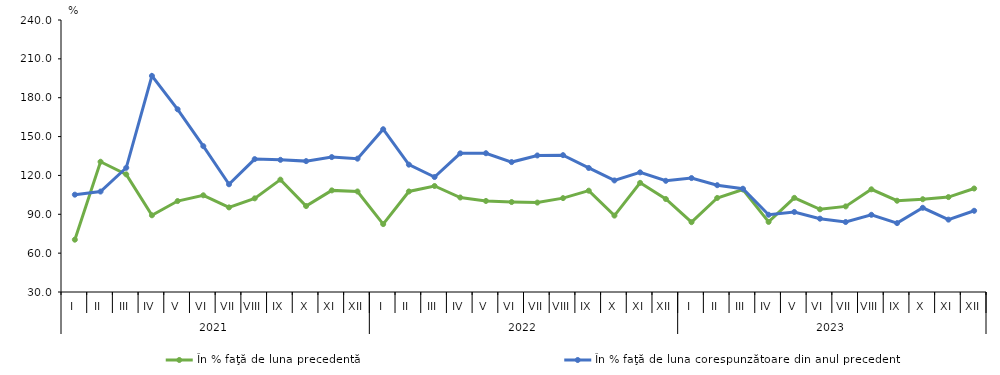
| Category | În % faţă de luna precedentă | În % faţă de luna corespunzătoare din anul precedent |
|---|---|---|
| 0 | 70.398 | 105.144 |
| 1 | 130.566 | 107.561 |
| 2 | 120.83 | 125.886 |
| 3 | 89.231 | 196.848 |
| 4 | 100.211 | 171.057 |
| 5 | 104.661 | 142.587 |
| 6 | 95.309 | 113.159 |
| 7 | 102.303 | 132.588 |
| 8 | 116.743 | 132.038 |
| 9 | 96.368 | 131.048 |
| 10 | 108.452 | 134.158 |
| 11 | 107.608 | 132.944 |
| 12 | 82.428 | 155.663 |
| 13 | 107.628 | 128.317 |
| 14 | 111.836 | 118.766 |
| 15 | 102.959 | 137.038 |
| 16 | 100.29 | 137.145 |
| 17 | 99.449 | 130.317 |
| 18 | 99.043 | 135.422 |
| 19 | 102.484 | 135.661 |
| 20 | 108.228 | 125.766 |
| 21 | 88.983 | 116.128 |
| 22 | 114.267 | 122.355 |
| 23 | 101.801 | 115.855 |
| 24 | 83.927 | 117.961 |
| 25 | 102.611 | 112.462 |
| 26 | 109.121 | 109.731 |
| 27 | 84.109 | 89.641 |
| 28 | 102.689 | 91.785 |
| 29 | 93.852 | 86.619 |
| 30 | 96.087 | 84.033 |
| 31 | 109.275 | 89.601 |
| 32 | 100.47 | 83.179 |
| 33 | 101.644 | 95.014 |
| 34 | 103.276 | 85.874 |
| 35 | 109.898 | 92.705 |